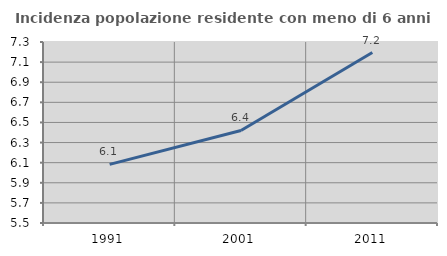
| Category | Incidenza popolazione residente con meno di 6 anni |
|---|---|
| 1991.0 | 6.083 |
| 2001.0 | 6.42 |
| 2011.0 | 7.196 |